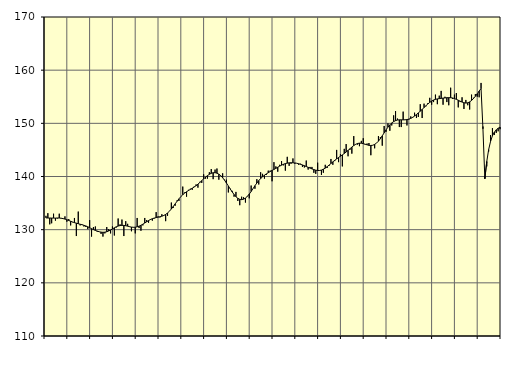
| Category | Samtliga sysselsatta (inkl. sysselsatta utomlands) | Series 1 |
|---|---|---|
| nan | 132.6 | 132.22 |
| 1.0 | 133.1 | 132.19 |
| 1.0 | 131 | 132.19 |
| 1.0 | 131.2 | 132.18 |
| 1.0 | 133 | 132.18 |
| 1.0 | 131.7 | 132.17 |
| 1.0 | 132.1 | 132.2 |
| 1.0 | 133 | 132.19 |
| 1.0 | 132.2 | 132.15 |
| 1.0 | 132.1 | 132.08 |
| 1.0 | 132.5 | 131.99 |
| 1.0 | 131.5 | 131.87 |
| nan | 132 | 131.73 |
| 2.0 | 130.8 | 131.58 |
| 2.0 | 131.4 | 131.45 |
| 2.0 | 132.2 | 131.32 |
| 2.0 | 128.8 | 131.22 |
| 2.0 | 133.4 | 131.12 |
| 2.0 | 130.8 | 131.02 |
| 2.0 | 131 | 130.93 |
| 2.0 | 130.6 | 130.82 |
| 2.0 | 130.5 | 130.7 |
| 2.0 | 130.1 | 130.54 |
| 2.0 | 131.8 | 130.37 |
| nan | 128.7 | 130.19 |
| 3.0 | 130.5 | 130.02 |
| 3.0 | 130.6 | 129.86 |
| 3.0 | 129.6 | 129.73 |
| 3.0 | 129.6 | 129.61 |
| 3.0 | 129.2 | 129.54 |
| 3.0 | 128.7 | 129.5 |
| 3.0 | 129.3 | 129.53 |
| 3.0 | 130.5 | 129.61 |
| 3.0 | 130.1 | 129.75 |
| 3.0 | 129.3 | 129.93 |
| 3.0 | 130.6 | 130.13 |
| nan | 128.9 | 130.35 |
| 4.0 | 130.4 | 130.54 |
| 4.0 | 132.1 | 130.68 |
| 4.0 | 131 | 130.77 |
| 4.0 | 131.9 | 130.81 |
| 4.0 | 128.8 | 130.8 |
| 4.0 | 131.6 | 130.74 |
| 4.0 | 131.1 | 130.66 |
| 4.0 | 130.6 | 130.56 |
| 4.0 | 129.7 | 130.48 |
| 4.0 | 130.5 | 130.45 |
| 4.0 | 129.3 | 130.46 |
| nan | 132.2 | 130.54 |
| 5.0 | 130.3 | 130.66 |
| 5.0 | 129.8 | 130.83 |
| 5.0 | 130.8 | 131.03 |
| 5.0 | 132.2 | 131.25 |
| 5.0 | 131.8 | 131.48 |
| 5.0 | 131.3 | 131.71 |
| 5.0 | 132 | 131.91 |
| 5.0 | 131.7 | 132.06 |
| 5.0 | 132.1 | 132.18 |
| 5.0 | 133.3 | 132.27 |
| 5.0 | 132.5 | 132.35 |
| nan | 132.3 | 132.43 |
| 6.0 | 132.9 | 132.53 |
| 6.0 | 132.6 | 132.67 |
| 6.0 | 131.6 | 132.87 |
| 6.0 | 132.6 | 133.14 |
| 6.0 | 133.5 | 133.48 |
| 6.0 | 135.1 | 133.89 |
| 6.0 | 134.1 | 134.36 |
| 6.0 | 134.5 | 134.85 |
| 6.0 | 135.5 | 135.34 |
| 6.0 | 135.4 | 135.8 |
| 6.0 | 136.2 | 136.22 |
| nan | 138.1 | 136.57 |
| 7.0 | 137 | 136.87 |
| 7.0 | 136.2 | 137.13 |
| 7.0 | 137.5 | 137.36 |
| 7.0 | 137.7 | 137.57 |
| 7.0 | 137.5 | 137.79 |
| 7.0 | 138.1 | 138.02 |
| 7.0 | 138.5 | 138.27 |
| 7.0 | 137.9 | 138.56 |
| 7.0 | 139 | 138.88 |
| 7.0 | 138.8 | 139.22 |
| 7.0 | 140.4 | 139.56 |
| nan | 139.6 | 139.88 |
| 8.0 | 139.6 | 140.16 |
| 8.0 | 140.8 | 140.41 |
| 8.0 | 141.4 | 140.6 |
| 8.0 | 139.5 | 140.71 |
| 8.0 | 141.3 | 140.72 |
| 8.0 | 141.5 | 140.63 |
| 8.0 | 139.4 | 140.44 |
| 8.0 | 140.2 | 140.15 |
| 8.0 | 140.6 | 139.76 |
| 8.0 | 139.4 | 139.3 |
| 8.0 | 139.4 | 138.77 |
| nan | 137 | 138.22 |
| 9.0 | 137.7 | 137.65 |
| 9.0 | 137.3 | 137.11 |
| 9.0 | 136.2 | 136.61 |
| 9.0 | 137.1 | 136.2 |
| 9.0 | 135.4 | 135.89 |
| 9.0 | 134.6 | 135.71 |
| 9.0 | 136.2 | 135.65 |
| 9.0 | 136.1 | 135.73 |
| 9.0 | 135.1 | 135.94 |
| 9.0 | 136.2 | 136.27 |
| 9.0 | 135.9 | 136.69 |
| nan | 138.3 | 137.19 |
| 10.0 | 137.7 | 137.73 |
| 10.0 | 137.7 | 138.27 |
| 10.0 | 139.5 | 138.77 |
| 10.0 | 138.5 | 139.23 |
| 10.0 | 140.8 | 139.62 |
| 10.0 | 140.5 | 139.95 |
| 10.0 | 139.6 | 140.24 |
| 10.0 | 140.3 | 140.49 |
| 10.0 | 141.1 | 140.71 |
| 10.0 | 141.1 | 140.93 |
| 10.0 | 139.1 | 141.14 |
| nan | 142.7 | 141.33 |
| 11.0 | 141.9 | 141.53 |
| 11.0 | 140.9 | 141.74 |
| 11.0 | 142.2 | 141.95 |
| 11.0 | 142.9 | 142.13 |
| 11.0 | 142.1 | 142.3 |
| 11.0 | 141.1 | 142.43 |
| 11.0 | 143.7 | 142.51 |
| 11.0 | 142 | 142.57 |
| 11.0 | 142.4 | 142.59 |
| 11.0 | 143.4 | 142.58 |
| 11.0 | 142.4 | 142.55 |
| nan | 142.5 | 142.49 |
| 12.0 | 142.2 | 142.4 |
| 12.0 | 142.4 | 142.29 |
| 12.0 | 141.8 | 142.17 |
| 12.0 | 141.7 | 142.03 |
| 12.0 | 143 | 141.88 |
| 12.0 | 141.3 | 141.73 |
| 12.0 | 141.8 | 141.58 |
| 12.0 | 141.8 | 141.43 |
| 12.0 | 140.7 | 141.3 |
| 12.0 | 140.5 | 141.19 |
| 12.0 | 142.6 | 141.13 |
| nan | 141.1 | 141.13 |
| 13.0 | 140.3 | 141.21 |
| 13.0 | 140.7 | 141.37 |
| 13.0 | 142.2 | 141.58 |
| 13.0 | 141.6 | 141.84 |
| 13.0 | 142 | 142.14 |
| 13.0 | 143.3 | 142.45 |
| 13.0 | 142.2 | 142.75 |
| 13.0 | 142.9 | 143.04 |
| 13.0 | 145 | 143.31 |
| 13.0 | 142.7 | 143.57 |
| 13.0 | 144.2 | 143.82 |
| nan | 141.9 | 144.07 |
| 14.0 | 145.2 | 144.33 |
| 14.0 | 146.1 | 144.61 |
| 14.0 | 143.8 | 144.91 |
| 14.0 | 145 | 145.22 |
| 14.0 | 144.3 | 145.53 |
| 14.0 | 147.6 | 145.82 |
| 14.0 | 146.1 | 146.05 |
| 14.0 | 146 | 146.21 |
| 14.0 | 145.7 | 146.27 |
| 14.0 | 146.7 | 146.26 |
| 14.0 | 147.2 | 146.18 |
| nan | 146 | 146.07 |
| 15.0 | 146.2 | 145.96 |
| 15.0 | 146.3 | 145.86 |
| 15.0 | 144 | 145.83 |
| 15.0 | 145.9 | 145.88 |
| 15.0 | 145.3 | 146.04 |
| 15.0 | 146.3 | 146.29 |
| 15.0 | 147.6 | 146.65 |
| 15.0 | 147.4 | 147.11 |
| 15.0 | 145.8 | 147.65 |
| 15.0 | 149.5 | 148.21 |
| 15.0 | 148.4 | 148.77 |
| nan | 150 | 149.28 |
| 16.0 | 148.6 | 149.72 |
| 16.0 | 149.6 | 150.07 |
| 16.0 | 151.5 | 150.33 |
| 16.0 | 152.3 | 150.51 |
| 16.0 | 150.9 | 150.62 |
| 16.0 | 149.3 | 150.66 |
| 16.0 | 149.3 | 150.66 |
| 16.0 | 152.2 | 150.65 |
| 16.0 | 150.7 | 150.66 |
| 16.0 | 149.6 | 150.71 |
| 16.0 | 150.7 | 150.79 |
| nan | 151.3 | 150.93 |
| 17.0 | 151.2 | 151.12 |
| 17.0 | 152 | 151.37 |
| 17.0 | 151 | 151.66 |
| 17.0 | 151.2 | 151.97 |
| 17.0 | 153.6 | 152.28 |
| 17.0 | 151 | 152.62 |
| 17.0 | 153.7 | 152.97 |
| 17.0 | 153.2 | 153.31 |
| 17.0 | 153.8 | 153.64 |
| 17.0 | 154.8 | 153.94 |
| 17.0 | 153.5 | 154.19 |
| nan | 154 | 154.38 |
| 18.0 | 155.4 | 154.51 |
| 18.0 | 153.6 | 154.59 |
| 18.0 | 155.2 | 154.65 |
| 18.0 | 156.1 | 154.7 |
| 18.0 | 153.5 | 154.74 |
| 18.0 | 155 | 154.78 |
| 18.0 | 154 | 154.82 |
| 18.0 | 153.4 | 154.83 |
| 18.0 | 156.7 | 154.82 |
| 18.0 | 154.6 | 154.77 |
| 18.0 | 155.4 | 154.66 |
| nan | 155.7 | 154.51 |
| 19.0 | 153 | 154.35 |
| 19.0 | 154 | 154.17 |
| 19.0 | 154.9 | 154 |
| 19.0 | 152.7 | 153.87 |
| 19.0 | 154.4 | 153.81 |
| 19.0 | 153.4 | 153.86 |
| 19.0 | 152.6 | 154.03 |
| 19.0 | 155.4 | 154.3 |
| 19.0 | 154.8 | 154.66 |
| 19.0 | 155.5 | 155.08 |
| 19.0 | 155 | 155.56 |
| nan | 154.9 | 156.06 |
| 20.0 | 157.6 | 156.55 |
| 20.0 | 149.4 | 148.97 |
| 20.0 | 140 | 139.59 |
| 20.0 | 141.9 | 142.81 |
| 20.0 | 144.7 | 145.06 |
| 20.0 | 147.8 | 146.6 |
| 20.0 | 149.1 | 147.65 |
| 20.0 | 147.8 | 148.34 |
| 20.0 | 148.2 | 148.78 |
| 20.0 | 148.5 | 149.08 |
| 20.0 | 148.9 | 149.29 |